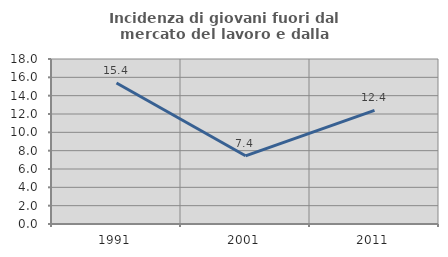
| Category | Incidenza di giovani fuori dal mercato del lavoro e dalla formazione  |
|---|---|
| 1991.0 | 15.385 |
| 2001.0 | 7.438 |
| 2011.0 | 12.389 |